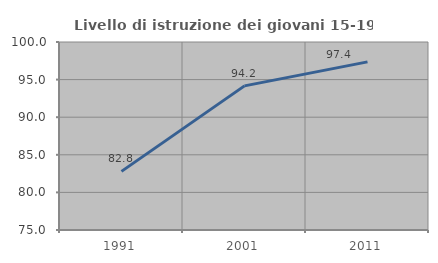
| Category | Livello di istruzione dei giovani 15-19 anni |
|---|---|
| 1991.0 | 82.796 |
| 2001.0 | 94.165 |
| 2011.0 | 97.357 |